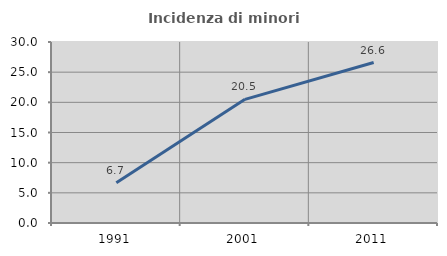
| Category | Incidenza di minori stranieri |
|---|---|
| 1991.0 | 6.667 |
| 2001.0 | 20.497 |
| 2011.0 | 26.598 |